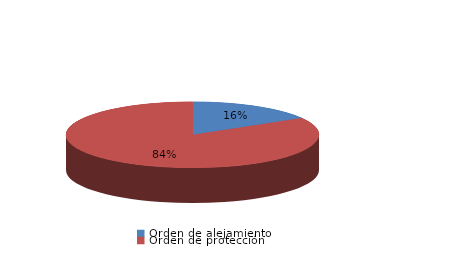
| Category | Series 0 |
|---|---|
| Orden de alejamiento | 27 |
| Orden de protección | 137 |